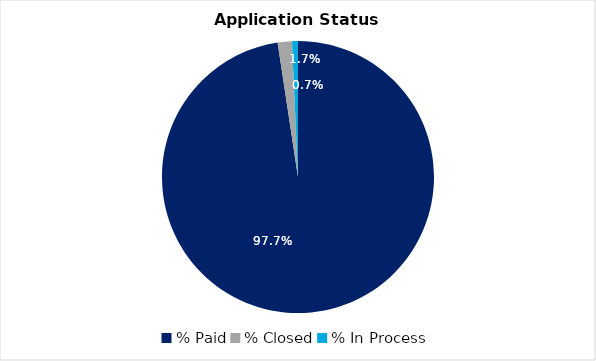
| Category | Series 0 |
|---|---|
| % Paid | 0.977 |
| % Closed | 0.017 |
| % In Process | 0.007 |